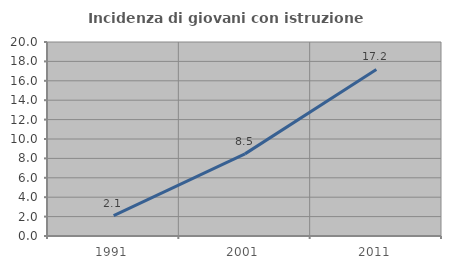
| Category | Incidenza di giovani con istruzione universitaria |
|---|---|
| 1991.0 | 2.094 |
| 2001.0 | 8.466 |
| 2011.0 | 17.176 |